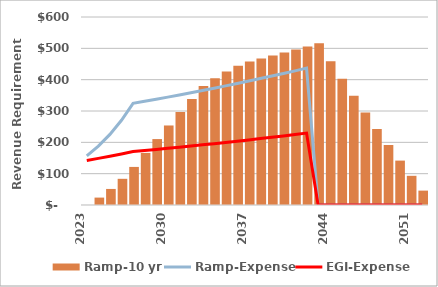
| Category | Ramp-10 yr |
|---|---|
| 2023.0 | 0 |
| 2024.0 | 23.663 |
| 2025.0 | 51.258 |
| 2026.0 | 83.569 |
| 2027.0 | 121.542 |
| 2028.0 | 166.308 |
| 2029.0 | 210.393 |
| 2030.0 | 253.784 |
| 2031.0 | 296.467 |
| 2032.0 | 338.428 |
| 2033.0 | 379.652 |
| 2034.0 | 404.476 |
| 2035.0 | 426.206 |
| 2036.0 | 444.36 |
| 2037.0 | 458.363 |
| 2038.0 | 467.531 |
| 2039.0 | 476.881 |
| 2040.0 | 486.419 |
| 2041.0 | 496.147 |
| 2042.0 | 506.07 |
| 2043.0 | 516.192 |
| 2044.0 | 459.156 |
| 2045.0 | 403.26 |
| 2046.0 | 348.529 |
| 2047.0 | 294.984 |
| 2048.0 | 242.649 |
| 2049.0 | 191.55 |
| 2050.0 | 141.71 |
| 2051.0 | 93.154 |
| 2052.0 | 45.909 |